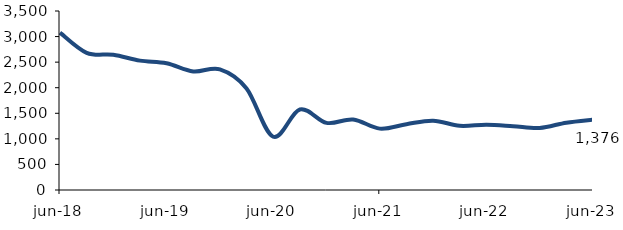
| Category | Series 1 |
|---|---|
| 2018-06-01 | 3076.997 |
| 2018-09-01 | 2682.71 |
| 2018-12-01 | 2642.761 |
| 2019-03-01 | 2529.475 |
| 2019-06-01 | 2477.642 |
| 2019-09-01 | 2318.566 |
| 2019-12-01 | 2360.025 |
| 2020-03-01 | 1986.731 |
| 2020-06-01 | 1041.097 |
| 2020-09-01 | 1574.171 |
| 2020-12-01 | 1312.033 |
| 2021-03-01 | 1379.069 |
| 2021-06-01 | 1200.162 |
| 2021-09-01 | 1286.539 |
| 2021-12-01 | 1355.491 |
| 2022-03-01 | 1255.288 |
| 2022-06-01 | 1277.156 |
| 2022-09-01 | 1248.515 |
| 2022-12-01 | 1212.726 |
| 2023-03-01 | 1316.417 |
| 2023-06-01 | 1375.806 |